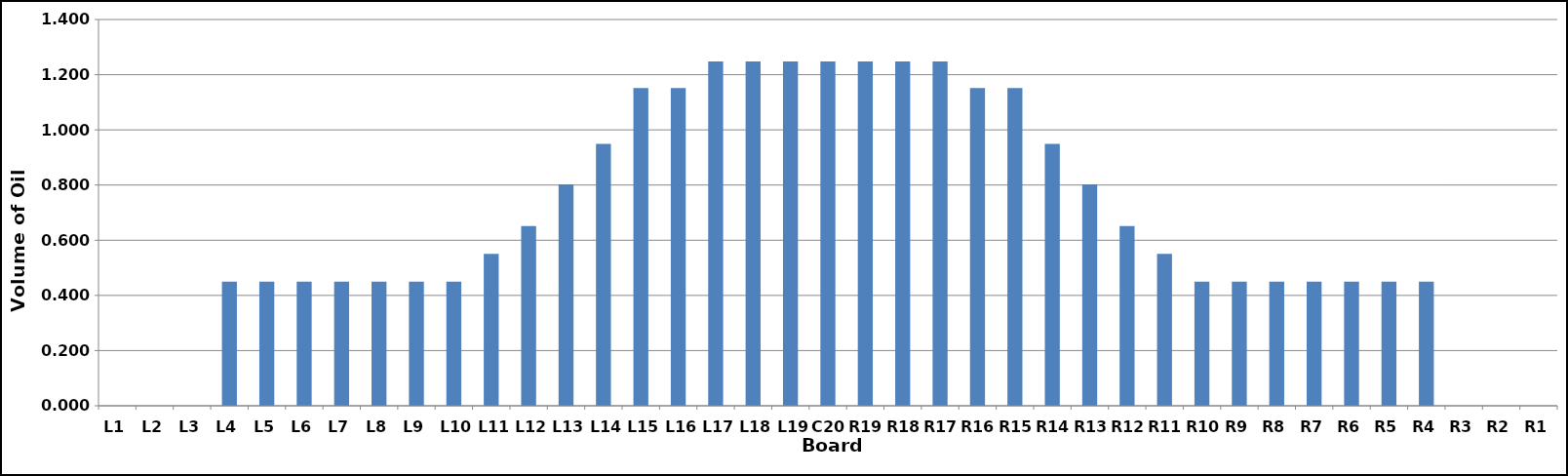
| Category | Series 0 |
|---|---|
| L1 | 0 |
| L2 | 0 |
| L3 | 0 |
| L4 | 0.45 |
| L5 | 0.45 |
| L6 | 0.45 |
| L7 | 0.45 |
| L8 | 0.45 |
| L9 | 0.45 |
| L10 | 0.45 |
| L11 | 0.55 |
| L12 | 0.651 |
| L13 | 0.803 |
| L14 | 0.949 |
| L15 | 1.151 |
| L16 | 1.151 |
| L17 | 1.248 |
| L18 | 1.248 |
| L19 | 1.248 |
| C20 | 1.248 |
| R19 | 1.248 |
| R18 | 1.248 |
| R17 | 1.248 |
| R16 | 1.151 |
| R15 | 1.151 |
| R14 | 0.949 |
| R13 | 0.803 |
| R12 | 0.651 |
| R11 | 0.55 |
| R10 | 0.45 |
| R9 | 0.45 |
| R8 | 0.45 |
| R7 | 0.45 |
| R6 | 0.45 |
| R5 | 0.45 |
| R4 | 0.45 |
| R3 | 0 |
| R2 | 0 |
| R1 | 0 |